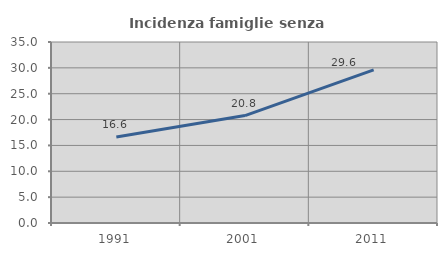
| Category | Incidenza famiglie senza nuclei |
|---|---|
| 1991.0 | 16.629 |
| 2001.0 | 20.768 |
| 2011.0 | 29.6 |